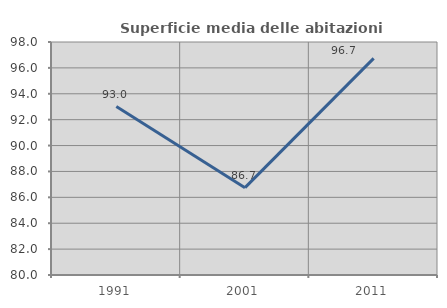
| Category | Superficie media delle abitazioni occupate |
|---|---|
| 1991.0 | 93.015 |
| 2001.0 | 86.747 |
| 2011.0 | 96.735 |